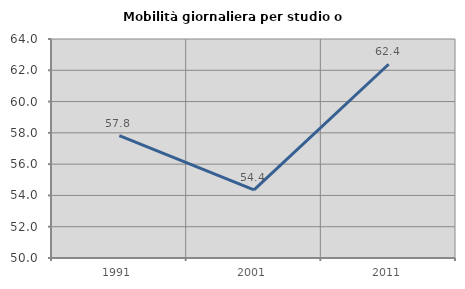
| Category | Mobilità giornaliera per studio o lavoro |
|---|---|
| 1991.0 | 57.824 |
| 2001.0 | 54.357 |
| 2011.0 | 62.386 |